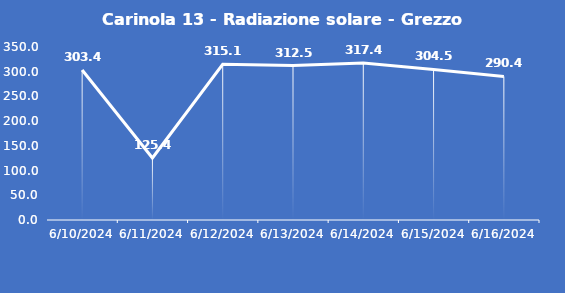
| Category | Carinola 13 - Radiazione solare - Grezzo (W/m2) |
|---|---|
| 6/10/24 | 303.4 |
| 6/11/24 | 125.4 |
| 6/12/24 | 315.1 |
| 6/13/24 | 312.5 |
| 6/14/24 | 317.4 |
| 6/15/24 | 304.5 |
| 6/16/24 | 290.4 |